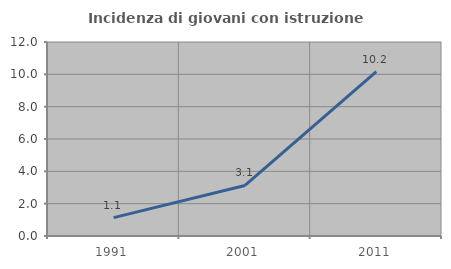
| Category | Incidenza di giovani con istruzione universitaria |
|---|---|
| 1991.0 | 1.136 |
| 2001.0 | 3.125 |
| 2011.0 | 10.169 |